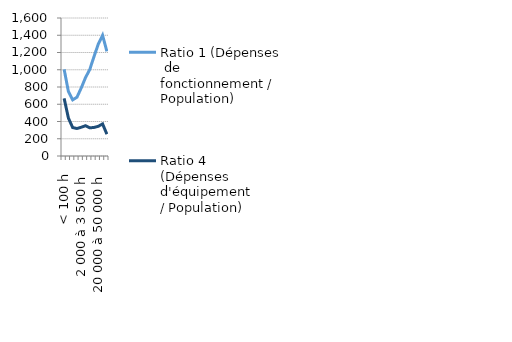
| Category | Ratio 1 (Dépenses  de fonctionnement / Population) | Ratio 4 
(Dépenses d'équipement 
/ Population) |
|---|---|---|
| < 100 h | 1005.189 | 668.172 |
| 100 à 200 h | 747.294 | 439.854 |
| 200 à 500 h | 650.631 | 329.466 |
| 500 à 2 000 h | 681.659 | 318.886 |
| 2 000 à 3 500 h | 788.418 | 333.152 |
| 3 500 à 5 000 h | 908.856 | 351.017 |
| 5 000 à 10 000 h | 1002.805 | 326.841 |
| 10 000 à 20 000 h | 1154.127 | 330.985 |
| 20 000 à 50 000 h | 1298.87 | 344.431 |
| 50 000 à 100 000 h | 1399.357 | 372.098 |
| >=100 000 h hors Paris | 1213.507 | 252.94 |